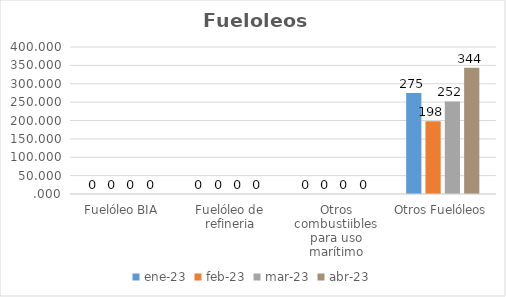
| Category | ene-23 | feb-23 | mar-23 | abr-23 |
|---|---|---|---|---|
| Fuelóleo BIA | 0 | 0 | 0 | 0 |
| Fuelóleo de refineria | 0.047 | 0.042 | 0.046 | 0.039 |
| Otros combustiibles para uso marítimo | 0 | 0 | 0.003 | 0 |
| Otros Fuelóleos | 274.909 | 197.784 | 251.957 | 343.664 |